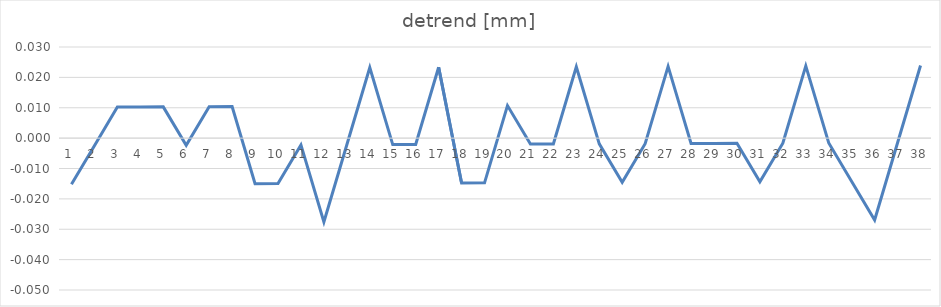
| Category | detrend [mm] |
|---|---|
| 0 | -0.015 |
| 1 | -0.002 |
| 2 | 0.01 |
| 3 | 0.01 |
| 4 | 0.01 |
| 5 | -0.002 |
| 6 | 0.01 |
| 7 | 0.01 |
| 8 | -0.015 |
| 9 | -0.015 |
| 10 | -0.002 |
| 11 | -0.028 |
| 12 | -0.002 |
| 13 | 0.023 |
| 14 | -0.002 |
| 15 | -0.002 |
| 16 | 0.023 |
| 17 | -0.015 |
| 18 | -0.015 |
| 19 | 0.011 |
| 20 | -0.002 |
| 21 | -0.002 |
| 22 | 0.023 |
| 23 | -0.002 |
| 24 | -0.015 |
| 25 | -0.002 |
| 26 | 0.024 |
| 27 | -0.002 |
| 28 | -0.002 |
| 29 | -0.002 |
| 30 | -0.014 |
| 31 | -0.002 |
| 32 | 0.024 |
| 33 | -0.002 |
| 34 | -0.014 |
| 35 | -0.027 |
| 36 | -0.002 |
| 37 | 0.024 |